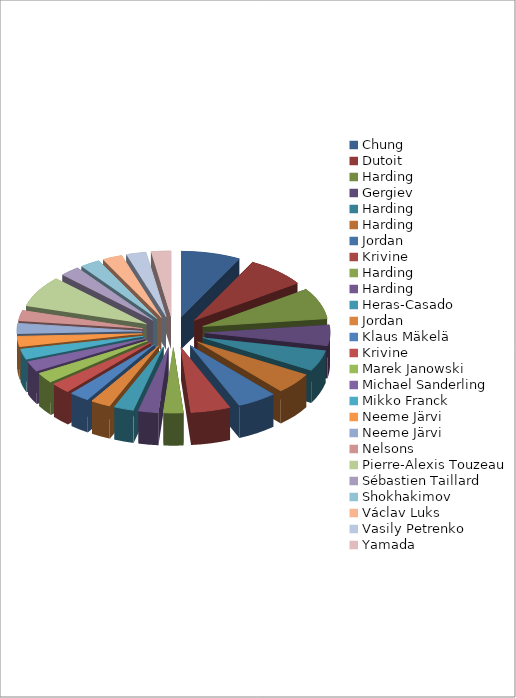
| Category | Series 0 |
|---|---|
| Chung | 3 |
| Dutoit | 3 |
| Harding | 3 |
| Gergiev | 2 |
| Harding | 2 |
| Harding | 2 |
| Jordan | 2 |
| Krivine | 2 |
| Harding | 1 |
| Harding | 1 |
| Heras-Casado | 1 |
| Jordan | 1 |
| Klaus Mäkelä | 1 |
| Krivine | 1 |
| Marek Janowski | 1 |
| Michael Sanderling  | 1 |
| Mikko Franck | 1 |
| Neeme Järvi  | 1 |
| Neeme Järvi  | 1 |
| Nelsons | 1 |
| Pierre-Alexis Touzeau | 3 |
| Sébastien Taillard | 1 |
| Shokhakimov | 1 |
| Václav Luks | 1 |
| Vasily Petrenko | 1 |
| Yamada | 1 |